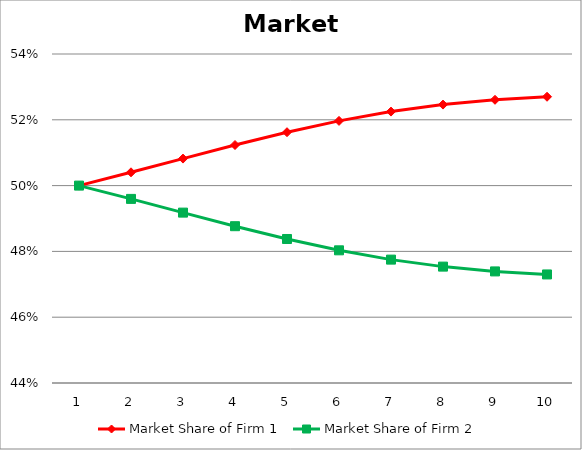
| Category | Market Share of Firm 1 | Market Share of Firm 2 |
|---|---|---|
| 0 | 0.5 | 0.5 |
| 1 | 0.504 | 0.496 |
| 2 | 0.508 | 0.492 |
| 3 | 0.512 | 0.488 |
| 4 | 0.516 | 0.484 |
| 5 | 0.52 | 0.48 |
| 6 | 0.522 | 0.478 |
| 7 | 0.525 | 0.475 |
| 8 | 0.526 | 0.474 |
| 9 | 0.527 | 0.473 |